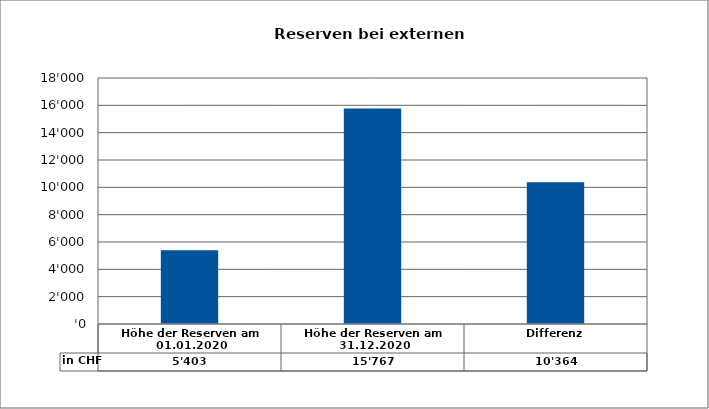
| Category | in CHF |
|---|---|
| Höhe der Reserven am 01.01.2020 | 5403.35 |
| Höhe der Reserven am 31.12.2020 | 15767.35 |
| Differenz | 10364 |